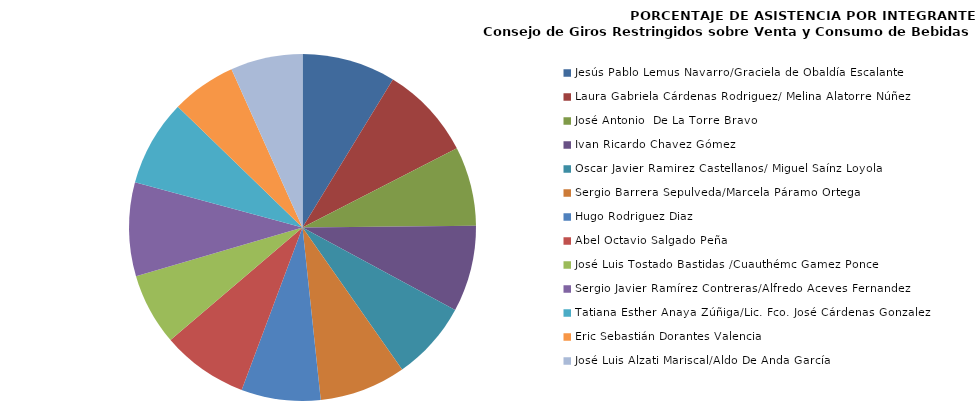
| Category | Series 0 |
|---|---|
| Jesús Pablo Lemus Navarro/Graciela de Obaldía Escalante | 100 |
| Laura Gabriela Cárdenas Rodriguez/ Melina Alatorre Núñez | 100 |
| José Antonio  De La Torre Bravo | 84.615 |
| Ivan Ricardo Chavez Gómez | 92.308 |
| Oscar Javier Ramirez Castellanos/ Miguel Saínz Loyola | 84.615 |
| Sergio Barrera Sepulveda/Marcela Páramo Ortega | 92.308 |
| Hugo Rodriguez Diaz | 84.615 |
| Abel Octavio Salgado Peña | 92.308 |
| José Luis Tostado Bastidas /Cuauthémc Gamez Ponce | 76.923 |
| Sergio Javier Ramírez Contreras/Alfredo Aceves Fernandez | 100 |
| Tatiana Esther Anaya Zúñiga/Lic. Fco. José Cárdenas Gonzalez | 92.308 |
| Eric Sebastián Dorantes Valencia | 69.231 |
| José Luis Alzati Mariscal/Aldo De Anda García | 76.923 |